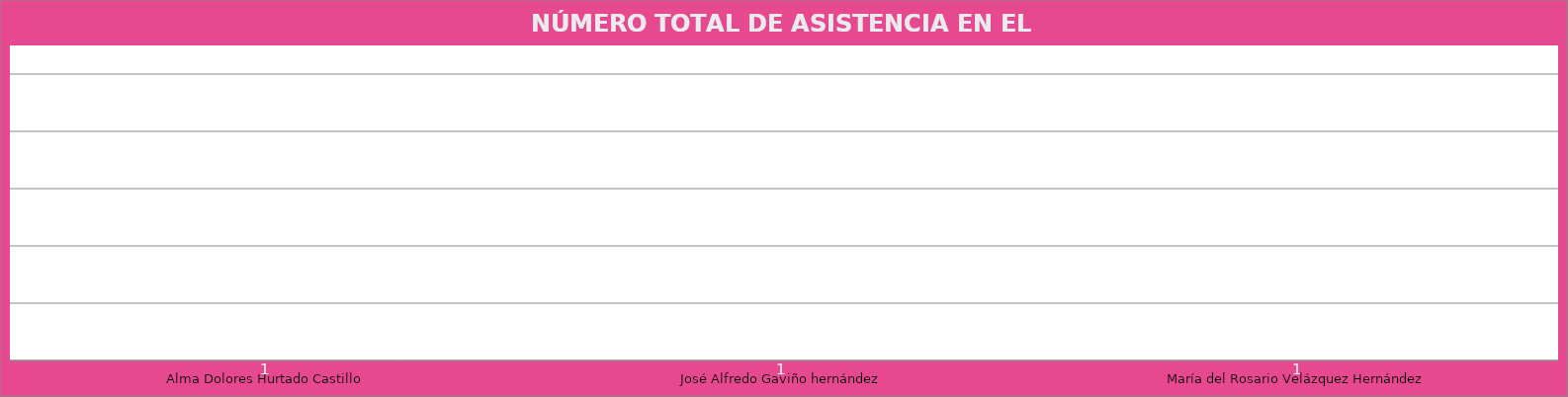
| Category | Alma Dolores Hurtado Castillo |
|---|---|
| Alma Dolores Hurtado Castillo | 1 |
| José Alfredo Gaviño hernández | 1 |
| María del Rosario Velázquez Hernández | 1 |